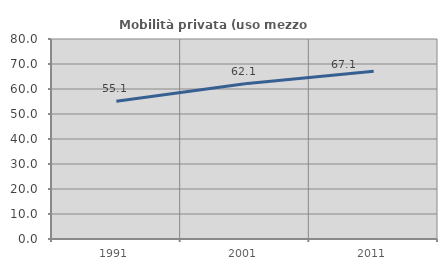
| Category | Mobilità privata (uso mezzo privato) |
|---|---|
| 1991.0 | 55.102 |
| 2001.0 | 62.079 |
| 2011.0 | 67.091 |